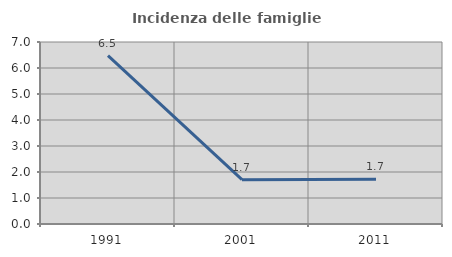
| Category | Incidenza delle famiglie numerose |
|---|---|
| 1991.0 | 6.475 |
| 2001.0 | 1.706 |
| 2011.0 | 1.718 |